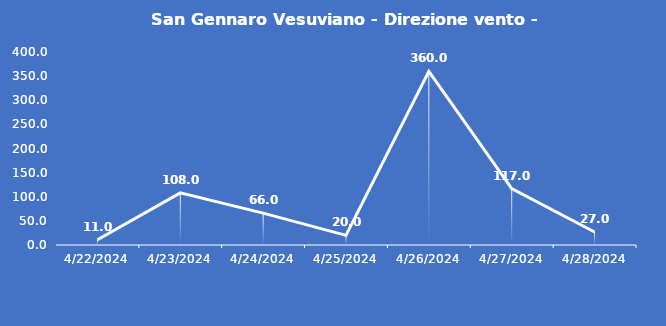
| Category | San Gennaro Vesuviano - Direzione vento - Grezzo (°N) |
|---|---|
| 4/22/24 | 11 |
| 4/23/24 | 108 |
| 4/24/24 | 66 |
| 4/25/24 | 20 |
| 4/26/24 | 360 |
| 4/27/24 | 117 |
| 4/28/24 | 27 |